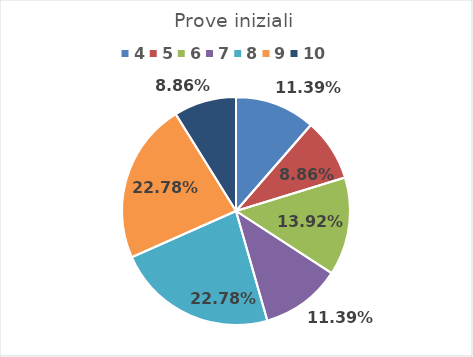
| Category | Series 0 |
|---|---|
| 4.0 | 0.114 |
| 5.0 | 0.089 |
| 6.0 | 0.139 |
| 7.0 | 0.114 |
| 8.0 | 0.228 |
| 9.0 | 0.228 |
| 10.0 | 0.089 |